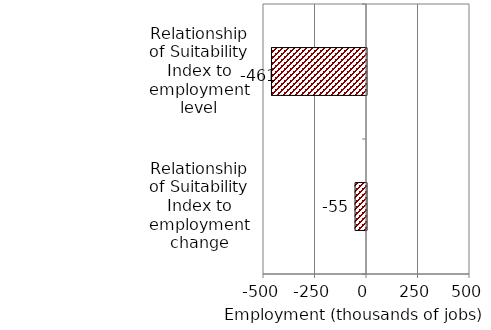
| Category | Series 0 |
|---|---|
| Relationship of Suitability Index to employment change | -55.49 |
| Relationship of Suitability Index to employment level | -461.3 |